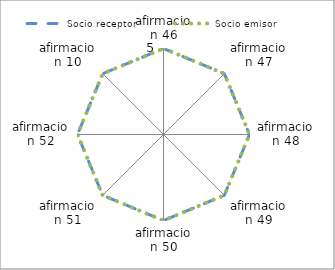
| Category | Socio receptor  | Socio emisor |
|---|---|---|
| afirmacion 46 | 5 | 5 |
| afirmacion 47 | 5 | 5 |
| afirmacion 48 | 5 | 5 |
| afirmacion 49 | 5 | 5 |
| afirmacion 50 | 5 | 5 |
| afirmacion 51 | 5 | 5 |
| afirmacion 52 | 5 | 5 |
| afirmacion 10 | 5 | 5 |